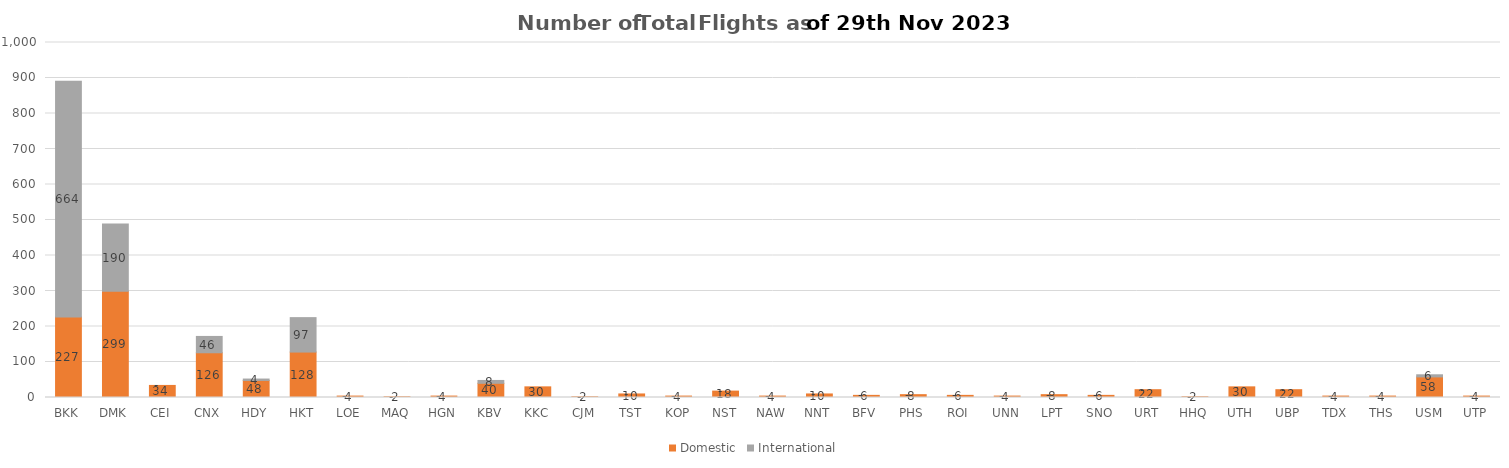
| Category | Domestic | International |
|---|---|---|
| BKK | 227 | 664 |
| DMK | 299 | 190 |
| CEI | 34 | 0 |
| CNX | 126 | 46 |
| HDY | 48 | 4 |
| HKT | 128 | 97 |
| LOE | 4 | 0 |
| MAQ | 2 | 0 |
| HGN | 4 | 0 |
| KBV | 40 | 8 |
| KKC | 30 | 0 |
| CJM | 2 | 0 |
| TST | 10 | 0 |
| KOP | 4 | 0 |
| NST | 18 | 0 |
| NAW | 4 | 0 |
| NNT | 10 | 0 |
| BFV | 6 | 0 |
| PHS | 8 | 0 |
| ROI | 6 | 0 |
| UNN | 4 | 0 |
| LPT | 8 | 0 |
| SNO | 6 | 0 |
| URT | 22 | 0 |
| HHQ | 2 | 0 |
| UTH | 30 | 0 |
| UBP | 22 | 0 |
| TDX | 4 | 0 |
| THS | 4 | 0 |
| USM | 58 | 6 |
| UTP | 4 | 0 |